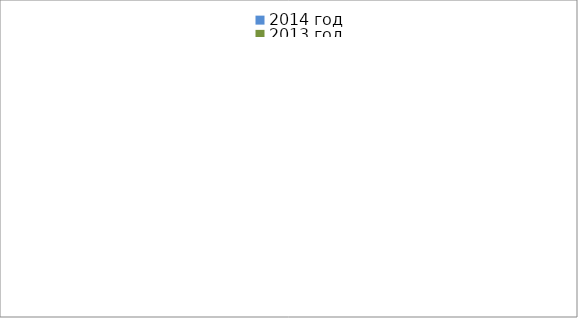
| Category | 2014 год | 2013 год |
|---|---|---|
|  - поджог | 25 | 35 |
|  - неосторожное обращение с огнём | 51 | 69 |
|  - НПТЭ электрооборудования | 21 | 22 |
|  - НПУ и Э печей | 77 | 65 |
|  - НПУ и Э транспортных средств | 72 | 60 |
|   -Шалость с огнем детей | 1 | 4 |
|  -НППБ при эксплуатации эл.приборов | 20 | 30 |
|  - курение | 22 | 12 |
| - прочие | 111 | 93 |
| - не установленные причины | 8 | 3 |